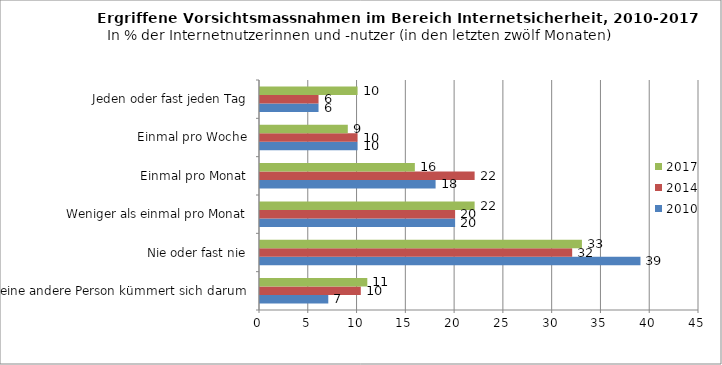
| Category | 2010 | 2014 | 2017 |
|---|---|---|---|
| eine andere Person kümmert sich darum | 7 | 10.332 | 11 |
| Nie oder fast nie | 39 | 32 | 33 |
| Weniger als einmal pro Monat | 20 | 20 | 22 |
| Einmal pro Monat | 18 | 22 | 15.873 |
| Einmal pro Woche | 10 | 10 | 9 |
| Jeden oder fast jeden Tag | 6 | 6 | 10 |